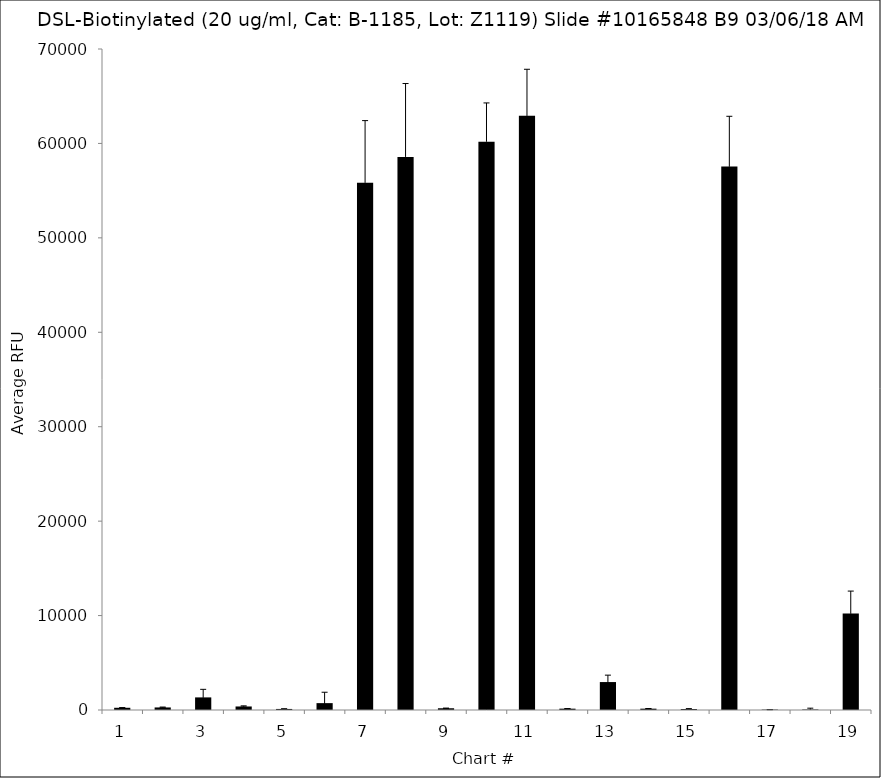
| Category | Series 0 |
|---|---|
| 1.0 | 235.25 |
| 2.0 | 270 |
| 3.0 | 1334.5 |
| 4.0 | 373.25 |
| 5.0 | 111.75 |
| 6.0 | 728 |
| 7.0 | 55844 |
| 8.0 | 58570.25 |
| 9.0 | 184.25 |
| 10.0 | 60190.5 |
| 11.0 | 62919.75 |
| 12.0 | 140.75 |
| 13.0 | 2959 |
| 14.0 | 140 |
| 15.0 | 105.25 |
| 16.0 | 57547.75 |
| 17.0 | 40.5 |
| 18.0 | 53 |
| 19.0 | 10221.5 |